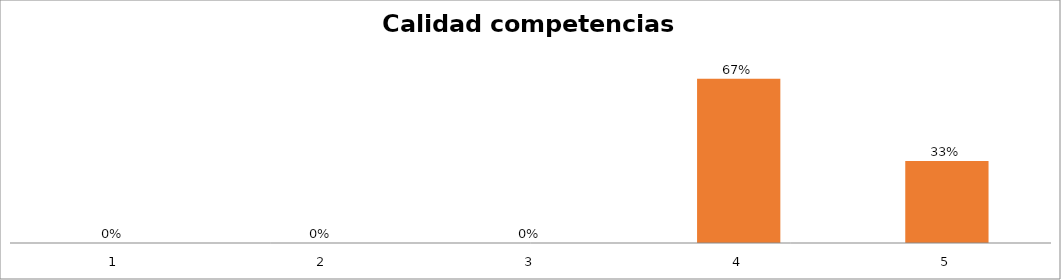
| Category | Series 1 |
|---|---|
| 0 | 0 |
| 1 | 0 |
| 2 | 0 |
| 3 | 0.667 |
| 4 | 0.333 |